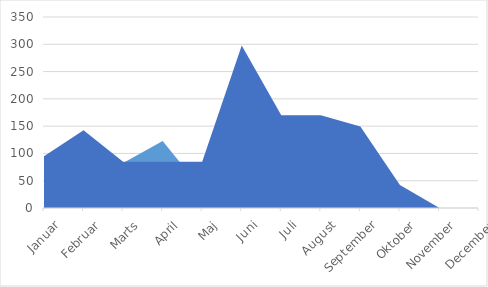
| Category | D | I | R | T | K |
|---|---|---|---|---|---|
| Januar | 56.23 | 0 | 62.24 | 0 | 94.84 |
| Februar | 69.35 | 0 | 20.74 | 0 | 142.61 |
| Marts | 82.44 | 0 | 0 | 0 | 84.57 |
| April | 122.8 | 0 | 8.94 | 0 | 84.77 |
| Maj | 33.57 | 0 | 52.29 | 0 | 84.9 |
| Juni | 0 | 0 | 24.3 | 0 | 297.84 |
| Juli | 0 | 5.16 | 12.23 | 0 | 170.1 |
| August | 0 | 0 | 50.05 | 0 | 170.09 |
| September | 0 | 0 | 19.03 | 0 | 149.26 |
| Oktober | 0 | 0 | 0 | 0 | 42.25 |
| November | 0 | 0 | 0 | 0 | 0 |
| December | 0 | 0 | 0 | 0 | 0 |